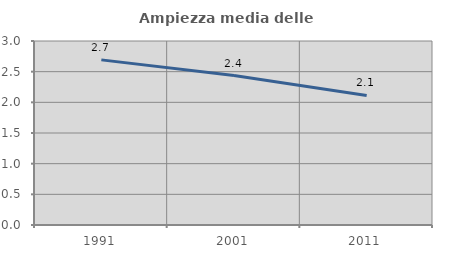
| Category | Ampiezza media delle famiglie |
|---|---|
| 1991.0 | 2.692 |
| 2001.0 | 2.436 |
| 2011.0 | 2.112 |